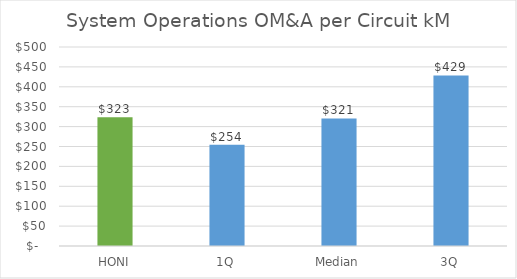
| Category | System Operations OM&A per Circuit kM |
|---|---|
| HONI | 323.278 |
| 1Q | 254.25 |
| Median | 320.512 |
| 3Q | 428.588 |